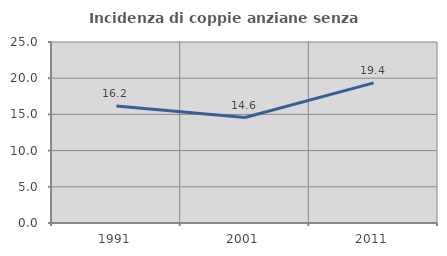
| Category | Incidenza di coppie anziane senza figli  |
|---|---|
| 1991.0 | 16.172 |
| 2001.0 | 14.566 |
| 2011.0 | 19.361 |